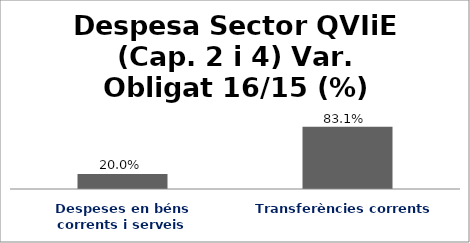
| Category | Series 0 |
|---|---|
| Despeses en béns corrents i serveis | 0.2 |
| Transferències corrents | 0.831 |